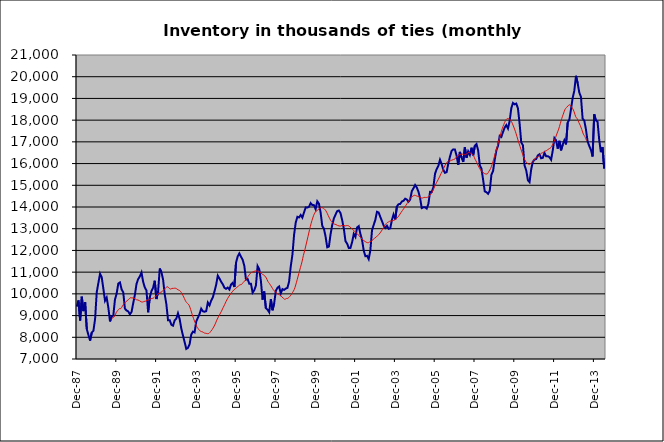
| Category | Series 0 |
|---|---|
| 1983-12-01 | 9414 |
| 1984-01-01 | 9699 |
| 1984-02-01 | 8775 |
| 1984-03-01 | 9870 |
| 1984-04-01 | 9205 |
| 1984-05-01 | 9619 |
| 1984-06-01 | 8382 |
| 1984-07-01 | 8104 |
| 1984-08-01 | 7848 |
| 1984-09-01 | 8218 |
| 1984-10-01 | 8300 |
| 1984-11-01 | 8832 |
| 1984-12-01 | 10074 |
| 1985-01-01 | 10504 |
| 1985-02-01 | 10927 |
| 1985-03-01 | 10771 |
| 1985-04-01 | 10235 |
| 1985-05-01 | 9680 |
| 1985-06-01 | 9826 |
| 1985-07-01 | 9371 |
| 1985-08-01 | 8732 |
| 1985-09-01 | 8966 |
| 1985-10-01 | 9005 |
| 1985-11-01 | 9740 |
| 1985-12-01 | 10008 |
| 1986-01-01 | 10474 |
| 1986-02-01 | 10527 |
| 1986-03-01 | 10205 |
| 1986-04-01 | 10070 |
| 1986-05-01 | 9316 |
| 1986-06-01 | 9234 |
| 1986-07-01 | 9191 |
| 1986-08-01 | 9057 |
| 1986-09-01 | 9167 |
| 1986-10-01 | 9571 |
| 1986-11-01 | 9949 |
| 1986-12-01 | 10463 |
| 1987-01-01 | 10681 |
| 1987-02-01 | 10803 |
| 1987-03-01 | 10982 |
| 1987-04-01 | 10551 |
| 1987-05-01 | 10294 |
| 1987-06-01 | 10156 |
| 1987-07-01 | 9151 |
| 1987-08-01 | 9852 |
| 1987-09-01 | 10122 |
| 1987-10-01 | 10286 |
| 1987-11-01 | 10604 |
| 1987-12-01 | 9760 |
| 1988-01-01 | 10097 |
| 1988-02-01 | 11165 |
| 1988-03-01 | 10997 |
| 1988-04-01 | 10666 |
| 1988-05-01 | 9979 |
| 1988-06-01 | 9520 |
| 1988-07-01 | 8785 |
| 1988-08-01 | 8787 |
| 1988-09-01 | 8580 |
| 1988-10-01 | 8533 |
| 1988-11-01 | 8780 |
| 1988-12-01 | 8862 |
| 1989-01-01 | 9106 |
| 1989-02-01 | 8840 |
| 1989-03-01 | 8402 |
| 1989-04-01 | 8081 |
| 1989-05-01 | 7779 |
| 1989-06-01 | 7465 |
| 1989-07-01 | 7514 |
| 1989-08-01 | 7680 |
| 1989-09-01 | 8127 |
| 1989-10-01 | 8258 |
| 1989-11-01 | 8226 |
| 1989-12-01 | 8729 |
| 1990-01-01 | 8901 |
| 1990-02-01 | 9072 |
| 1990-03-01 | 9317 |
| 1990-04-01 | 9197 |
| 1990-05-01 | 9178 |
| 1990-06-01 | 9202 |
| 1990-07-01 | 9599 |
| 1990-08-01 | 9469 |
| 1990-09-01 | 9688 |
| 1990-10-01 | 9834 |
| 1990-11-01 | 10112 |
| 1990-12-01 | 10409 |
| 1991-01-01 | 10839 |
| 1991-02-01 | 10708 |
| 1991-03-01 | 10559 |
| 1991-04-01 | 10446 |
| 1991-05-01 | 10281 |
| 1991-06-01 | 10231 |
| 1991-07-01 | 10289 |
| 1991-08-01 | 10200 |
| 1991-09-01 | 10433 |
| 1991-10-01 | 10511 |
| 1991-11-01 | 10314 |
| 1991-12-01 | 11435 |
| 1992-01-01 | 11722 |
| 1992-02-01 | 11863 |
| 1992-03-01 | 11710 |
| 1992-04-01 | 11572 |
| 1992-05-01 | 11293 |
| 1992-06-01 | 10655 |
| 1992-07-01 | 10682 |
| 1992-08-01 | 10463 |
| 1992-09-01 | 10468 |
| 1992-10-01 | 10058 |
| 1992-11-01 | 10168 |
| 1992-12-01 | 10386 |
| 1993-01-01 | 11281 |
| 1993-02-01 | 11134 |
| 1993-03-01 | 10598 |
| 1993-04-01 | 9733 |
| 1993-05-01 | 10107 |
| 1993-06-01 | 9340 |
| 1993-07-01 | 9274 |
| 1993-08-01 | 9154 |
| 1993-09-01 | 9762 |
| 1993-10-01 | 9245 |
| 1993-11-01 | 9562 |
| 1993-12-01 | 10135 |
| 1994-01-01 | 10283 |
| 1994-02-01 | 10340 |
| 1994-03-01 | 10018 |
| 1994-04-01 | 10220 |
| 1994-05-01 | 10182 |
| 1994-06-01 | 10244 |
| 1994-07-01 | 10273 |
| 1994-08-01 | 10568 |
| 1994-09-01 | 11264 |
| 1994-10-01 | 11798 |
| 1994-11-01 | 12715 |
| 1994-12-01 | 13284 |
| 1995-01-01 | 13549 |
| 1995-02-01 | 13519 |
| 1995-03-01 | 13633 |
| 1995-04-01 | 13511 |
| 1995-05-01 | 13750 |
| 1995-06-01 | 13981 |
| 1995-07-01 | 13972 |
| 1995-08-01 | 14009 |
| 1995-09-01 | 14178 |
| 1995-10-01 | 14089 |
| 1995-11-01 | 14086 |
| 1995-12-01 | 13900 |
| 1996-01-01 | 14263 |
| 1996-02-01 | 14153 |
| 1996-03-01 | 13750 |
| 1996-04-01 | 13129 |
| 1996-05-01 | 13002 |
| 1996-06-01 | 12636 |
| 1996-07-01 | 12143 |
| 1996-08-01 | 12176.8 |
| 1996-09-01 | 12740.4 |
| 1996-10-01 | 13174 |
| 1996-11-01 | 13473 |
| 1996-12-01 | 13648 |
| 1997-01-01 | 13811 |
| 1997-02-01 | 13839 |
| 1997-03-01 | 13719 |
| 1997-04-01 | 13398 |
| 1997-05-01 | 13009 |
| 1997-06-01 | 12427 |
| 1997-07-01 | 12315 |
| 1997-08-01 | 12108 |
| 1997-09-01 | 12114 |
| 1997-10-01 | 12382 |
| 1997-11-01 | 12764 |
| 1997-12-01 | 12624 |
| 1998-01-01 | 13057 |
| 1998-02-01 | 13118 |
| 1998-03-01 | 12760 |
| 1998-04-01 | 12482 |
| 1998-05-01 | 11995.82 |
| 1998-06-01 | 11734.516 |
| 1998-07-01 | 11750.5 |
| 1998-08-01 | 11601.827 |
| 1998-09-01 | 12005.676 |
| 1998-10-01 | 12927.207 |
| 1998-11-01 | 13173.549 |
| 1998-12-01 | 13405.646 |
| 1999-01-01 | 13781.57 |
| 1999-02-01 | 13747.7 |
| 1999-03-01 | 13543.877 |
| 1999-04-01 | 13354.035 |
| 1999-05-01 | 13148.423 |
| 1999-06-01 | 13037.41 |
| 1999-07-01 | 13135.734 |
| 1999-08-01 | 12996.831 |
| 1999-09-01 | 13019.943 |
| 1999-10-01 | 13403.124 |
| 1999-11-01 | 13657.698 |
| 1999-12-01 | 13425.647 |
| 2000-01-01 | 14022.098 |
| 2000-02-01 | 14128.799 |
| 2000-03-01 | 14140.422 |
| 2000-04-01 | 14253.748 |
| 2000-05-01 | 14283.691 |
| 2000-06-01 | 14383.623 |
| 2000-07-01 | 14342.724 |
| 2000-08-01 | 14243.203 |
| 2000-09-01 | 14341.811 |
| 2000-10-01 | 14728.146 |
| 2000-11-01 | 14864.504 |
| 2000-12-01 | 15014.786 |
| 2001-01-01 | 14898.065 |
| 2001-02-01 | 14707.42 |
| 2001-03-01 | 14410.076 |
| 2001-04-01 | 13951.098 |
| 2001-05-01 | 13983.641 |
| 2001-06-01 | 13988.388 |
| 2001-07-01 | 13926.734 |
| 2001-08-01 | 14143.072 |
| 2001-09-01 | 14698.888 |
| 2001-10-01 | 14691.092 |
| 2001-11-01 | 14904.483 |
| 2001-12-01 | 15530.514 |
| 2002-01-01 | 15747.423 |
| 2002-02-01 | 15889.833 |
| 2002-03-01 | 16177.813 |
| 2002-04-01 | 15980.701 |
| 2002-05-01 | 15711.431 |
| 2002-06-01 | 15572.809 |
| 2002-07-01 | 15605.551 |
| 2002-08-01 | 16001.756 |
| 2002-09-01 | 16317.445 |
| 2002-10-01 | 16585.705 |
| 2002-11-01 | 16653.519 |
| 2002-12-01 | 16646.287 |
| 2003-01-01 | 16366.737 |
| 2003-02-01 | 15936.426 |
| 2003-03-01 | 16537.264 |
| 2003-04-01 | 16280.432 |
| 2003-05-01 | 16073.856 |
| 2003-06-01 | 16744.725 |
| 2003-07-01 | 16269.866 |
| 2003-08-01 | 16560.644 |
| 2003-09-01 | 16397.181 |
| 2003-10-01 | 16730.37 |
| 2003-11-01 | 16382.064 |
| 2003-12-01 | 16815.683 |
| 2004-01-01 | 16897.167 |
| 2004-02-01 | 16609.89 |
| 2004-03-01 | 15918.217 |
| 2004-04-01 | 15761.593 |
| 2004-05-01 | 15255.352 |
| 2004-06-01 | 14718.535 |
| 2004-07-01 | 14679.323 |
| 2004-08-01 | 14607.56 |
| 2004-09-01 | 14747.09 |
| 2004-10-01 | 15483.721 |
| 2004-11-01 | 15656.553 |
| 2004-12-01 | 16177.911 |
| 2005-01-01 | 16611.946 |
| 2005-02-01 | 16824.975 |
| 2005-03-01 | 17278.543 |
| 2005-04-01 | 17226.843 |
| 2005-05-01 | 17451.003 |
| 2005-06-01 | 17660.314 |
| 2005-07-01 | 17775.118 |
| 2005-08-01 | 17615.981 |
| 2005-09-01 | 17961.755 |
| 2005-10-01 | 18549.398 |
| 2005-11-01 | 18792.607 |
| 2005-12-01 | 18730.145 |
| 2006-01-01 | 18763.698 |
| 2006-02-01 | 18542.588 |
| 2006-03-01 | 17845.147 |
| 2006-04-01 | 16973.316 |
| 2006-05-01 | 16842.952 |
| 2006-06-01 | 15910.242 |
| 2006-07-01 | 15687.728 |
| 2006-08-01 | 15233.163 |
| 2006-09-01 | 15144.04 |
| 2006-10-01 | 15738.044 |
| 2006-11-01 | 16082.406 |
| 2006-12-01 | 16184.263 |
| 2007-01-01 | 16210.849 |
| 2007-02-01 | 16374.9 |
| 2007-03-01 | 16427.623 |
| 2007-04-01 | 16243.323 |
| 2007-05-01 | 16265.661 |
| 2007-06-01 | 16490.74 |
| 2007-07-01 | 16341.093 |
| 2007-08-01 | 16340.182 |
| 2007-09-01 | 16293.721 |
| 2007-10-01 | 16174.439 |
| 2007-11-01 | 16604.619 |
| 2007-12-01 | 17174.1 |
| 2008-01-01 | 17073.635 |
| 2008-02-01 | 16688.385 |
| 2008-03-01 | 17045.282 |
| 2008-04-01 | 16609.275 |
| 2008-05-01 | 16872.655 |
| 2008-06-01 | 17075.69 |
| 2008-07-01 | 16885.134 |
| 2008-08-01 | 17888.283 |
| 2008-09-01 | 18026.639 |
| 2008-10-01 | 18505.135 |
| 2008-11-01 | 19022.406 |
| 2008-12-01 | 19357 |
| 2009-01-01 | 20042.926 |
| 2009-02-01 | 19706 |
| 2009-03-01 | 19269.488 |
| 2009-04-01 | 19071.685 |
| 2009-05-01 | 18074.13 |
| 2009-06-01 | 17978.003 |
| 2009-07-01 | 17579.497 |
| 2009-08-01 | 17023.982 |
| 2009-09-01 | 16809.111 |
| 2009-10-01 | 16633.924 |
| 2009-11-01 | 16326.449 |
| 2009-12-01 | 18266.751 |
| 2010-01-01 | 17987.459 |
| 2010-02-01 | 17930.527 |
| 2010-03-01 | 17104.504 |
| 2010-04-01 | 16525.456 |
| 2010-05-01 | 16757.127 |
| 2010-06-01 | 15768.938 |